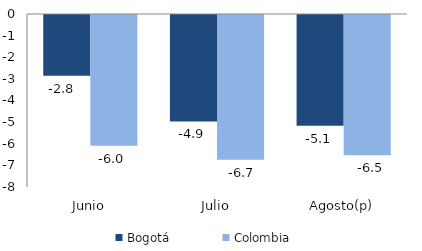
| Category | Bogotá | Colombia |
|---|---|---|
| Junio | -2.811 | -6.046 |
| Julio | -4.923 | -6.69 |
| Agosto(p) | -5.126 | -6.491 |